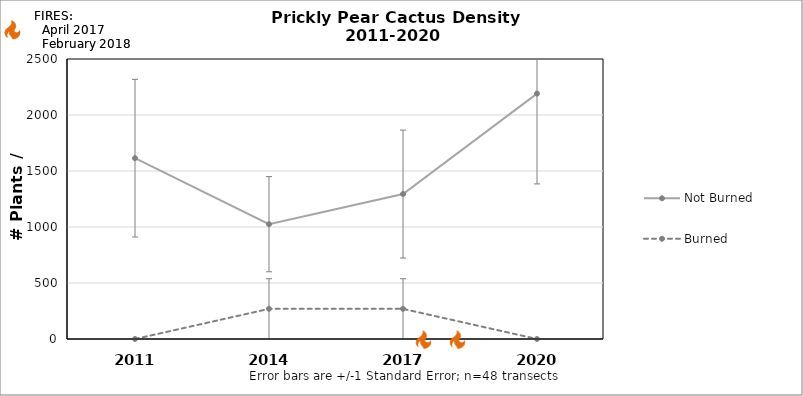
| Category | Not Burned | Burned |
|---|---|---|
| 2011.0 | 1614.585 | 0 |
| 2014.0 | 1025.133 | 269.098 |
| 2017.0 | 1294.231 | 269.098 |
| 2020.0 | 2191.222 | 0 |